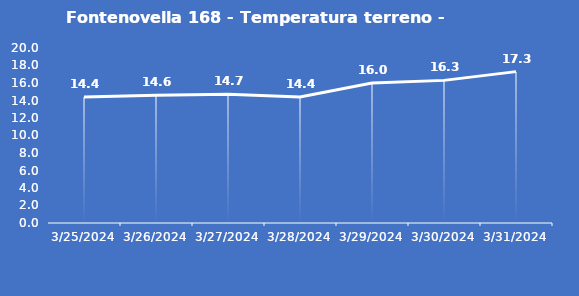
| Category | Fontenovella 168 - Temperatura terreno - Grezzo (°C) |
|---|---|
| 3/25/24 | 14.4 |
| 3/26/24 | 14.6 |
| 3/27/24 | 14.7 |
| 3/28/24 | 14.4 |
| 3/29/24 | 16 |
| 3/30/24 | 16.3 |
| 3/31/24 | 17.3 |